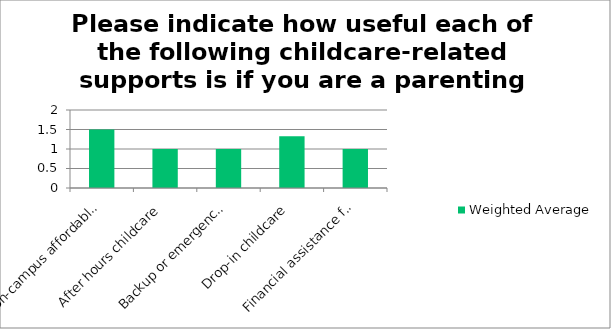
| Category | Weighted Average |
|---|---|
| On-campus affordable childcare | 1.5 |
| After hours childcare | 1 |
| Backup or emergency childcare | 1 |
| Drop-in childcare | 1.33 |
| Financial assistance for childcare | 1 |